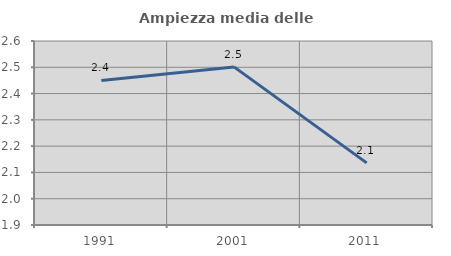
| Category | Ampiezza media delle famiglie |
|---|---|
| 1991.0 | 2.45 |
| 2001.0 | 2.501 |
| 2011.0 | 2.136 |